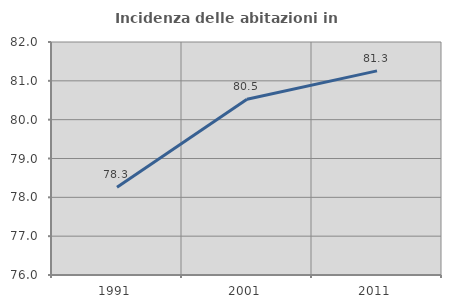
| Category | Incidenza delle abitazioni in proprietà  |
|---|---|
| 1991.0 | 78.261 |
| 2001.0 | 80.524 |
| 2011.0 | 81.256 |